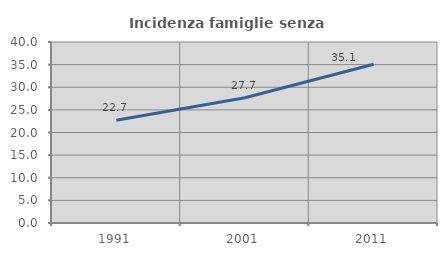
| Category | Incidenza famiglie senza nuclei |
|---|---|
| 1991.0 | 22.727 |
| 2001.0 | 27.677 |
| 2011.0 | 35.091 |